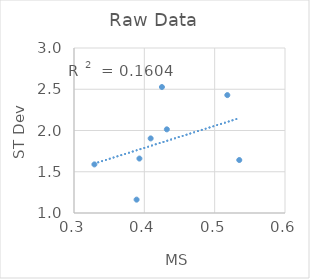
| Category | raw-stdev |
|---|---|
| 0.535 | 1.642 |
| 0.409 | 1.904 |
| 0.518 | 2.429 |
| 0.393 | 1.66 |
| 0.329 | 1.589 |
| 0.425 | 2.527 |
| 0.432 | 2.014 |
| 0.389 | 1.162 |